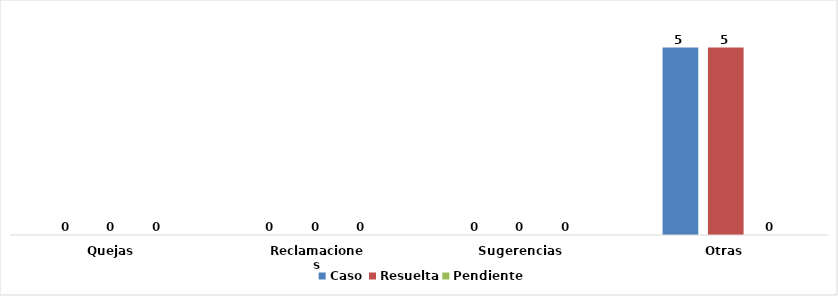
| Category | Caso | Resuelta | Pendiente |
|---|---|---|---|
| Quejas | 0 | 0 | 0 |
| Reclamaciones | 0 | 0 | 0 |
| Sugerencias | 0 | 0 | 0 |
| Otras | 5 | 5 | 0 |